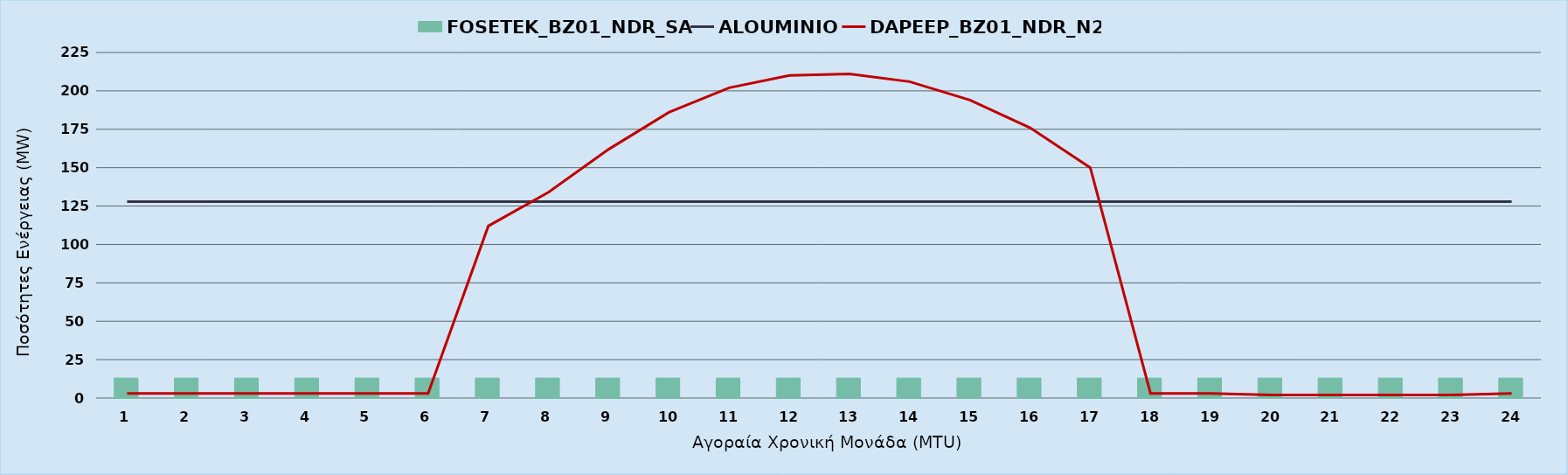
| Category | FOSETEK_BZ01_NDR_SA |
|---|---|
| 0 | 13 |
| 1 | 13 |
| 2 | 13 |
| 3 | 13 |
| 4 | 13 |
| 5 | 13 |
| 6 | 13 |
| 7 | 13 |
| 8 | 13 |
| 9 | 13 |
| 10 | 13 |
| 11 | 13 |
| 12 | 13 |
| 13 | 13 |
| 14 | 13 |
| 15 | 13 |
| 16 | 13 |
| 17 | 13 |
| 18 | 13 |
| 19 | 13 |
| 20 | 13 |
| 21 | 13 |
| 22 | 13 |
| 23 | 13 |